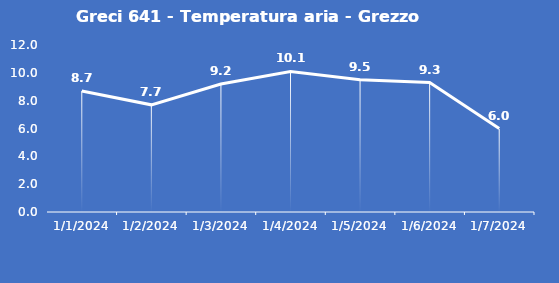
| Category | Greci 641 - Temperatura aria - Grezzo (°C) |
|---|---|
| 1/1/24 | 8.7 |
| 1/2/24 | 7.7 |
| 1/3/24 | 9.2 |
| 1/4/24 | 10.1 |
| 1/5/24 | 9.5 |
| 1/6/24 | 9.3 |
| 1/7/24 | 6 |